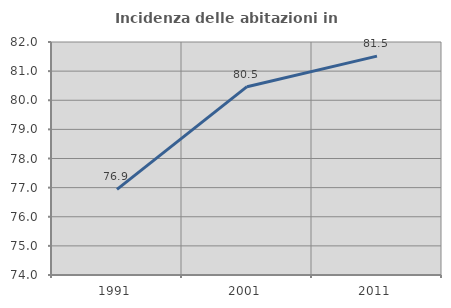
| Category | Incidenza delle abitazioni in proprietà  |
|---|---|
| 1991.0 | 76.941 |
| 2001.0 | 80.466 |
| 2011.0 | 81.514 |